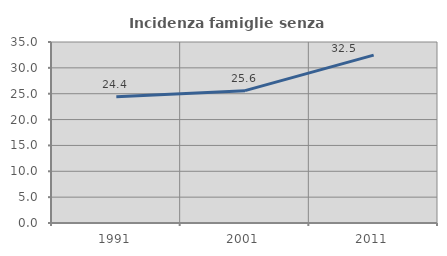
| Category | Incidenza famiglie senza nuclei |
|---|---|
| 1991.0 | 24.433 |
| 2001.0 | 25.592 |
| 2011.0 | 32.453 |